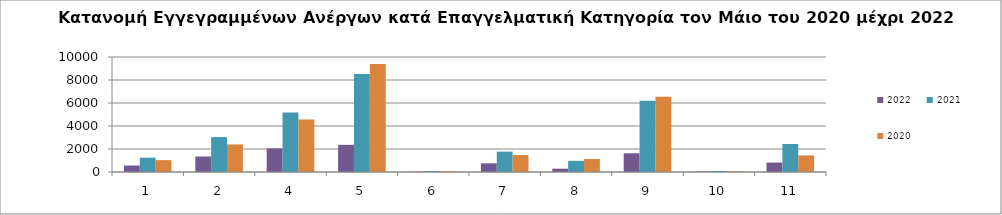
| Category | 2022 | 2021 | 2020 |
|---|---|---|---|
| 1.0 | 563 | 1246 | 1033 |
| 2.0 | 1346 | 3034 | 2398 |
| 4.0 | 2056 | 5181 | 4567 |
| 5.0 | 2362 | 8520 | 9381 |
| 6.0 | 24 | 77 | 64 |
| 7.0 | 755 | 1772 | 1474 |
| 8.0 | 288 | 972 | 1126 |
| 9.0 | 1626 | 6205 | 6537 |
| 10.0 | 42 | 92 | 52 |
| 11.0 | 819 | 2436 | 1439 |